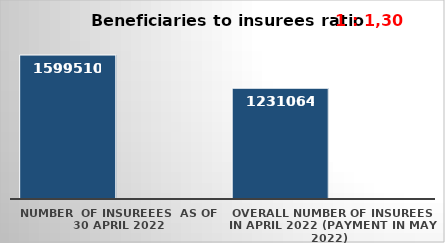
| Category | Series 0 | Series 1 |
|---|---|---|
| NUMBER  of insureees  as of  30 April 2022 | 1599510 |  |
| OVERALL number of insurees in April 2022 (payment in May 2022) | 1231064 |  |